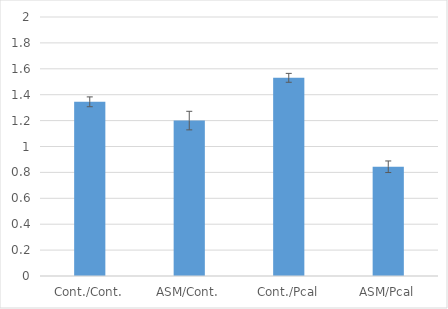
| Category | Series 0 |
|---|---|
| Cont./Cont. | 1.345 |
| ASM/Cont. | 1.2 |
| Cont./Pcal | 1.53 |
| ASM/Pcal | 0.844 |